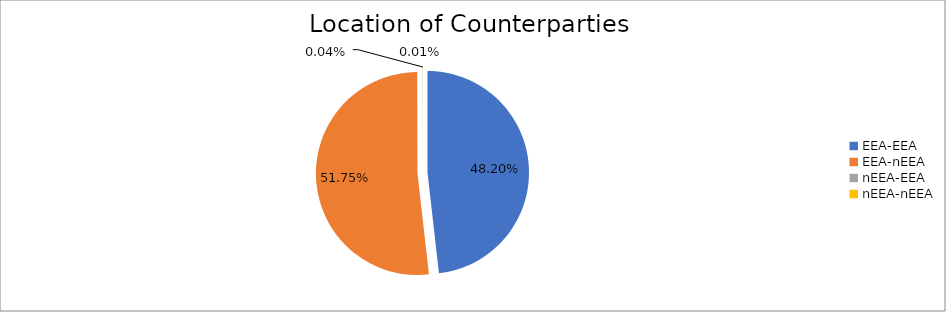
| Category | Series 0 |
|---|---|
| EEA-EEA | 6412202.39 |
| EEA-nEEA | 6884121.482 |
| nEEA-EEA | 5508.128 |
| nEEA-nEEA | 1222.661 |